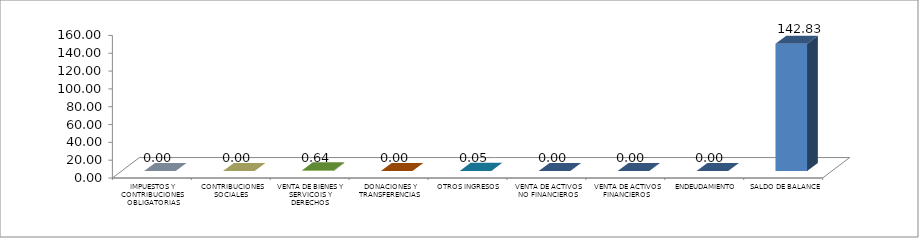
| Category | 1er Trimestre |
|---|---|
|  IMPUESTOS Y CONTRIBUCIONES OBLIGATORIAS | 0 |
|  CONTRIBUCIONES SOCIALES | 0 |
|  VENTA DE BIENES Y SERVICOIS Y DERECHOS ADMINISTRATIVOS | 0.641 |
|  DONACIONES Y TRANSFERENCIAS | 0 |
|  OTROS INGRESOS | 0.048 |
|  VENTA DE ACTIVOS NO FINANCIEROS | 0 |
|  VENTA DE ACTIVOS FINANCIEROS | 0 |
|  ENDEUDAMIENTO | 0 |
|  SALDO DE BALANCE | 142.834 |